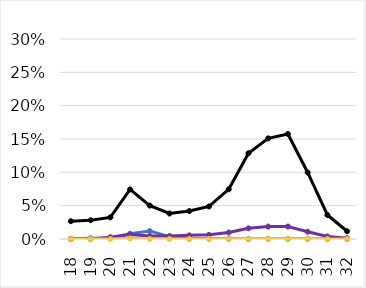
| Category | Total | miRNAs | TE | Virus |
|---|---|---|---|---|
| 18.0 | 0.027 | 0 | 0 | 0 |
| 19.0 | 0.028 | 0.001 | 0 | 0 |
| 20.0 | 0.032 | 0.001 | 0.003 | 0 |
| 21.0 | 0.074 | 0.008 | 0.007 | 0.001 |
| 22.0 | 0.05 | 0.012 | 0.004 | 0 |
| 23.0 | 0.038 | 0.004 | 0.004 | 0 |
| 24.0 | 0.042 | 0.001 | 0.005 | 0 |
| 25.0 | 0.049 | 0.001 | 0.006 | 0 |
| 26.0 | 0.075 | 0 | 0.01 | 0 |
| 27.0 | 0.129 | 0 | 0.016 | 0 |
| 28.0 | 0.151 | 0 | 0.019 | 0 |
| 29.0 | 0.158 | 0 | 0.019 | 0 |
| 30.0 | 0.1 | 0 | 0.011 | 0 |
| 31.0 | 0.036 | 0 | 0.004 | 0 |
| 32.0 | 0.012 | 0 | 0.001 | 0 |